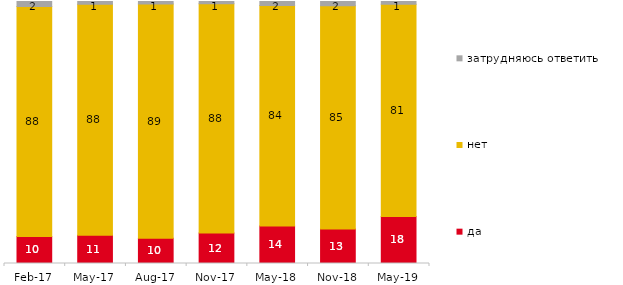
| Category | да | нет | затрудняюсь ответить |
|---|---|---|---|
| 2017-02-01 | 10.35 | 87.75 | 1.9 |
| 2017-05-01 | 10.75 | 88.2 | 1.05 |
| 2017-08-01 | 9.65 | 89.35 | 1 |
| 2017-11-01 | 11.6 | 87.55 | 0.85 |
| 2018-05-01 | 14.3 | 84.15 | 1.5 |
| 2018-11-01 | 13.174 | 85.18 | 1.647 |
| 2019-05-01 | 17.979 | 80.981 | 1.04 |